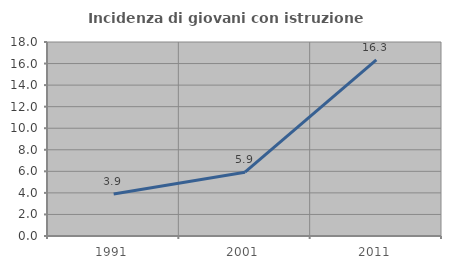
| Category | Incidenza di giovani con istruzione universitaria |
|---|---|
| 1991.0 | 3.889 |
| 2001.0 | 5.917 |
| 2011.0 | 16.35 |